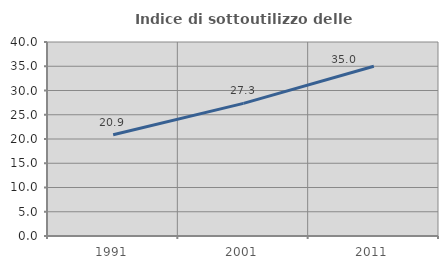
| Category | Indice di sottoutilizzo delle abitazioni  |
|---|---|
| 1991.0 | 20.893 |
| 2001.0 | 27.341 |
| 2011.0 | 35.005 |